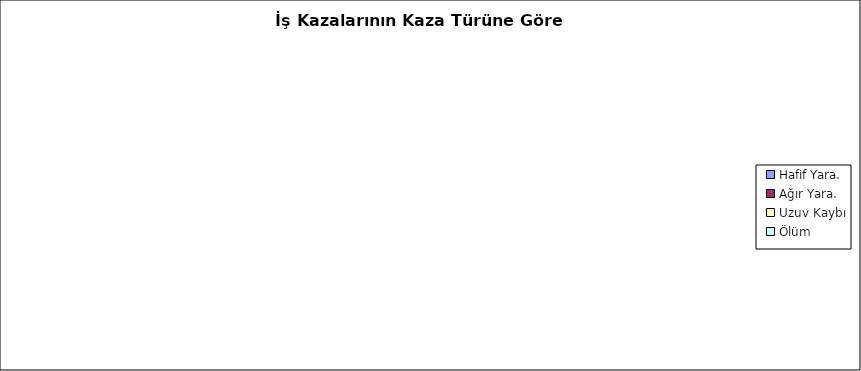
| Category | Series 0 |
|---|---|
| Hafif Yara. | 0 |
| Ağır Yara. | 0 |
| Uzuv Kaybı | 0 |
| Ölüm | 0 |